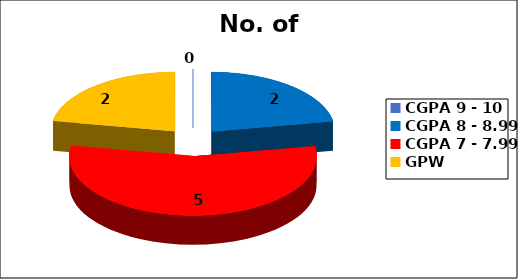
| Category | No. of Students |
|---|---|
| CGPA 9 - 10 | 0 |
| CGPA 8 - 8.99 | 2 |
| CGPA 7 - 7.99 | 5 |
| GPW | 2 |